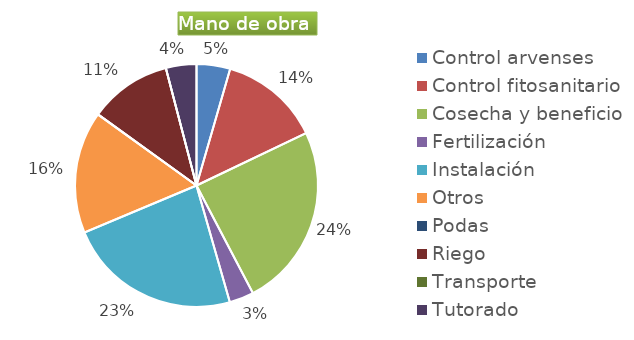
| Category | Series 0 |
|---|---|
| Control arvenses | 550000 |
| Control fitosanitario | 1650000 |
| Cosecha y beneficio | 3000600 |
| Fertilización | 400000 |
| Instalación | 2839286 |
| Otros | 2000000 |
| Podas | 0 |
| Riego | 1350000 |
| Transporte | 0 |
| Tutorado | 500000 |